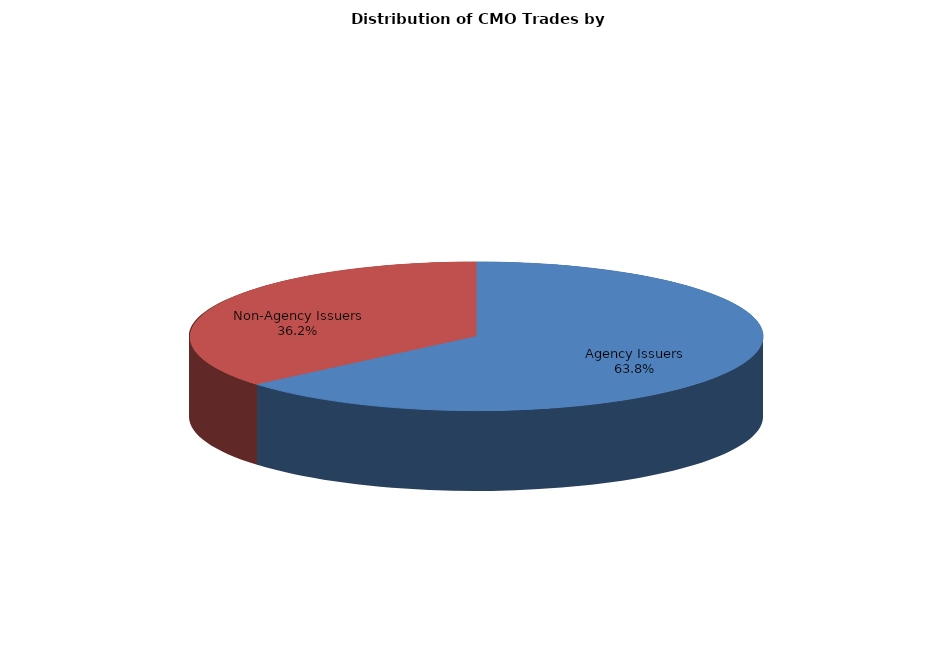
| Category | Series 0 |
|---|---|
| Agency Issuers | 1649.94 |
| Non-Agency Issuers | 936.405 |